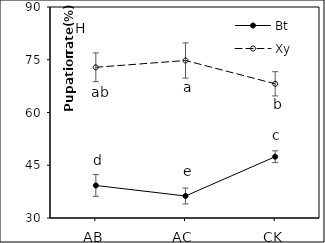
| Category | Bt | Xy |
|---|---|---|
| AB | 39.255 | 72.855 |
| AC | 36.26 | 74.79 |
| CK | 47.43 | 68.16 |